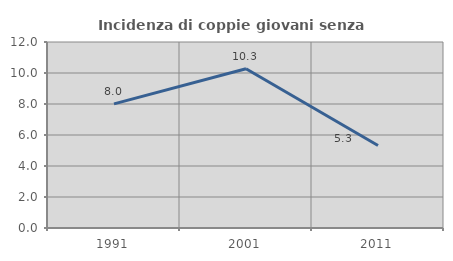
| Category | Incidenza di coppie giovani senza figli |
|---|---|
| 1991.0 | 8.008 |
| 2001.0 | 10.273 |
| 2011.0 | 5.318 |